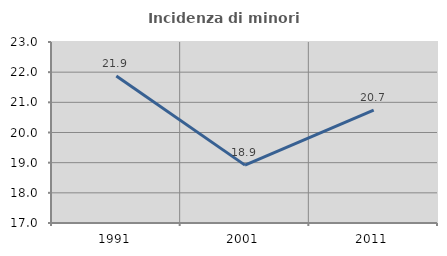
| Category | Incidenza di minori stranieri |
|---|---|
| 1991.0 | 21.875 |
| 2001.0 | 18.919 |
| 2011.0 | 20.744 |